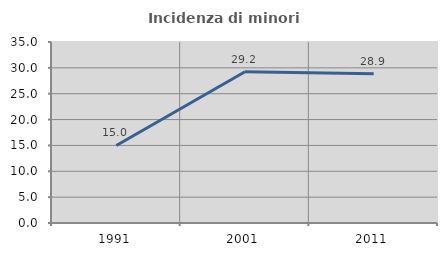
| Category | Incidenza di minori stranieri |
|---|---|
| 1991.0 | 15 |
| 2001.0 | 29.237 |
| 2011.0 | 28.875 |